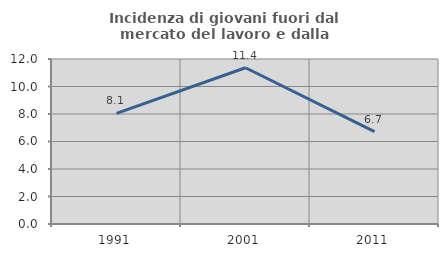
| Category | Incidenza di giovani fuori dal mercato del lavoro e dalla formazione  |
|---|---|
| 1991.0 | 8.051 |
| 2001.0 | 11.364 |
| 2011.0 | 6.716 |